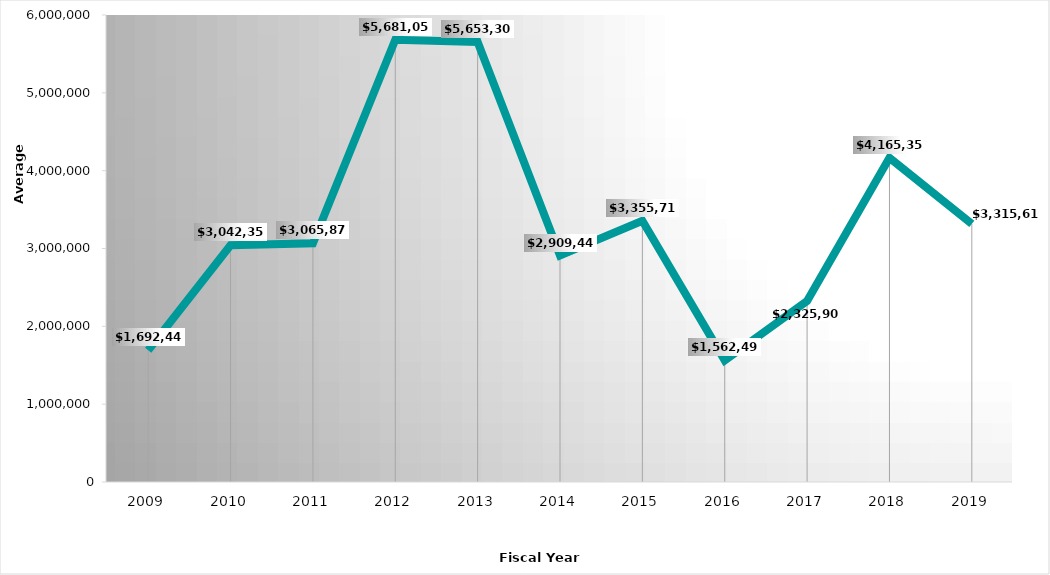
| Category | Mean |
|---|---|
| 2009.0 | 1692442 |
| 2010.0 | 3042359 |
| 2011.0 | 3065870 |
| 2012.0 | 5681055 |
| 2013.0 | 5653306 |
| 2014.0 | 2909446 |
| 2015.0 | 3355712 |
| 2016.0 | 1562498 |
| 2017.0 | 2325909 |
| 2018.0 | 4165355 |
| 2019.0 | 3315610 |